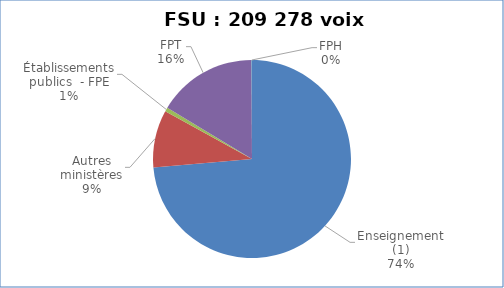
| Category | Nombre de voix |
|---|---|
| Enseignement (1) | 154066 |
| Autres ministères | 19661.5 |
| Établissements publics  - FPE | 1363 |
| FPT | 34043 |
| FPH | 144 |